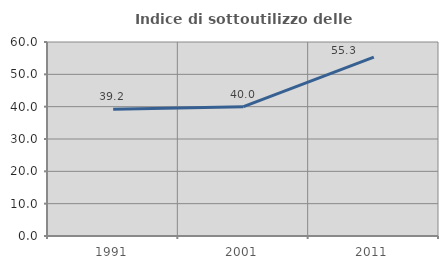
| Category | Indice di sottoutilizzo delle abitazioni  |
|---|---|
| 1991.0 | 39.194 |
| 2001.0 | 40 |
| 2011.0 | 55.319 |